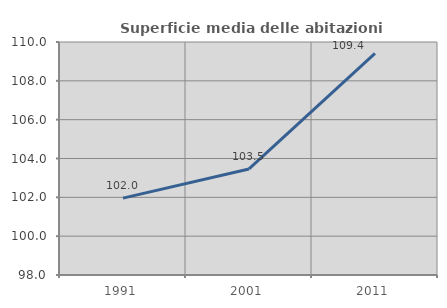
| Category | Superficie media delle abitazioni occupate |
|---|---|
| 1991.0 | 101.961 |
| 2001.0 | 103.463 |
| 2011.0 | 109.411 |